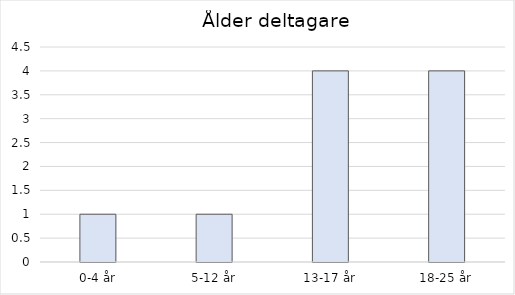
| Category | Series 0 |
|---|---|
| 0-4 år | 1 |
| 5-12 år | 1 |
| 13-17 år | 4 |
| 18-25 år | 4 |